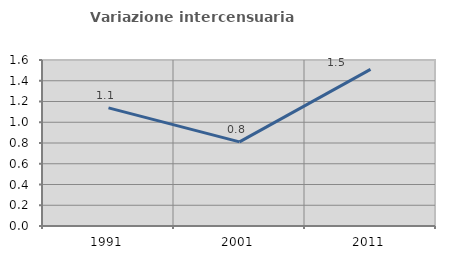
| Category | Variazione intercensuaria annua |
|---|---|
| 1991.0 | 1.139 |
| 2001.0 | 0.81 |
| 2011.0 | 1.51 |